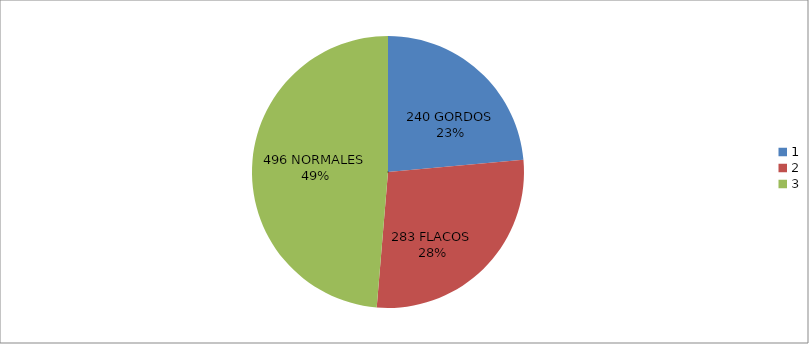
| Category | Series 0 |
|---|---|
| 0 | 240 |
| 1 | 283 |
| 2 | 496 |